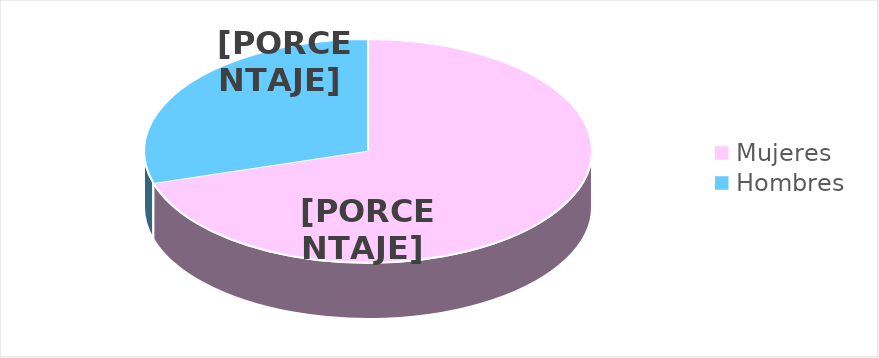
| Category | Series 0 |
|---|---|
| Mujeres | 19 |
| Hombres | 8 |